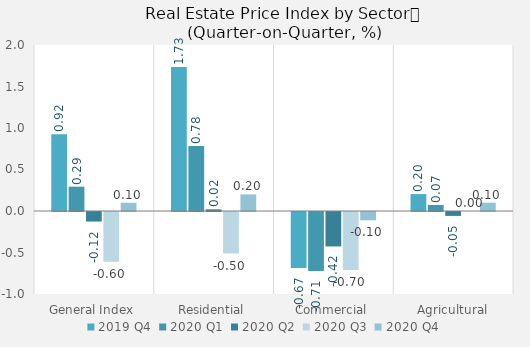
| Category | 2019 | 2020 |
|---|---|---|
| General Index | 0.924 | 0.1 |
| Residential | 1.734 | 0.2 |
| Commercial | -0.674 | -0.1 |
| Agricultural | 0.204 | 0.1 |